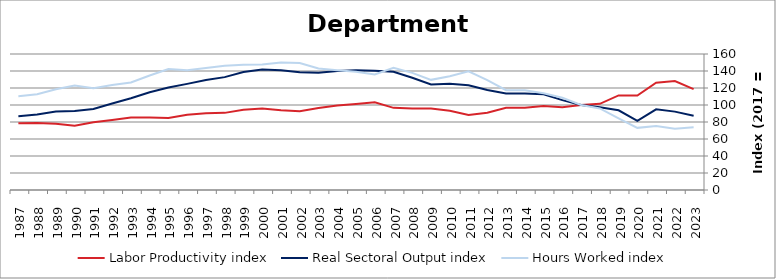
| Category | Labor Productivity index | Real Sectoral Output index | Hours Worked index |
|---|---|---|---|
| 2023.0 | 118.599 | 87.443 | 73.729 |
| 2022.0 | 128.15 | 92.204 | 71.95 |
| 2021.0 | 126.145 | 94.875 | 75.211 |
| 2020.0 | 111.19 | 81.291 | 73.11 |
| 2019.0 | 111.277 | 93.786 | 84.282 |
| 2018.0 | 101.402 | 97.352 | 96.006 |
| 2017.0 | 100 | 100 | 100 |
| 2016.0 | 97.455 | 105.7 | 108.46 |
| 2015.0 | 98.839 | 112.604 | 113.927 |
| 2014.0 | 96.721 | 113.415 | 117.26 |
| 2013.0 | 96.766 | 113.625 | 117.423 |
| 2012.0 | 90.979 | 117.57 | 129.228 |
| 2011.0 | 88.32 | 123.276 | 139.579 |
| 2010.0 | 93.323 | 124.989 | 133.931 |
| 2009.0 | 95.835 | 124.194 | 129.592 |
| 2008.0 | 95.843 | 132.037 | 137.763 |
| 2007.0 | 96.647 | 139.014 | 143.837 |
| 2006.0 | 103.183 | 140.251 | 135.924 |
| 2005.0 | 101.209 | 140.865 | 139.183 |
| 2004.0 | 99.365 | 139.975 | 140.869 |
| 2003.0 | 96.483 | 137.986 | 143.016 |
| 2002.0 | 92.715 | 138.558 | 149.445 |
| 2001.0 | 93.886 | 140.887 | 150.061 |
| 2000.0 | 95.929 | 141.635 | 147.645 |
| 1999.0 | 94.285 | 138.864 | 147.281 |
| 1998.0 | 90.75 | 132.779 | 146.313 |
| 1997.0 | 90.212 | 129.448 | 143.493 |
| 1996.0 | 88.613 | 124.876 | 140.923 |
| 1995.0 | 84.712 | 120.503 | 142.25 |
| 1994.0 | 85.358 | 115.012 | 134.741 |
| 1993.0 | 85.26 | 107.887 | 126.54 |
| 1992.0 | 82.413 | 101.825 | 123.555 |
| 1991.0 | 79.591 | 95.255 | 119.68 |
| 1990.0 | 75.665 | 93.036 | 122.957 |
| 1989.0 | 78.067 | 92.449 | 118.423 |
| 1988.0 | 78.938 | 88.878 | 112.591 |
| 1987.0 | 78.51 | 86.652 | 110.37 |